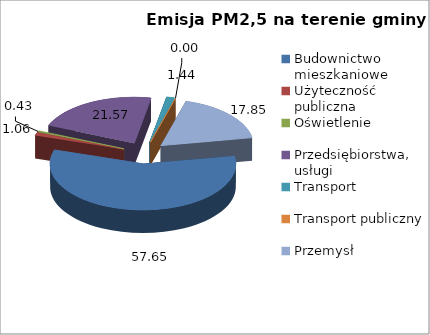
| Category | 57,65 1,06 0,43 21,57 1,44 0,00 17,85 |
|---|---|
| Budownictwo mieszkaniowe | 57.649 |
| Użyteczność publiczna | 1.063 |
| Oświetlenie | 0.428 |
| Przedsiębiorstwa, usługi | 21.567 |
| Transport | 1.445 |
| Transport publiczny | 0 |
| Przemysł | 17.849 |